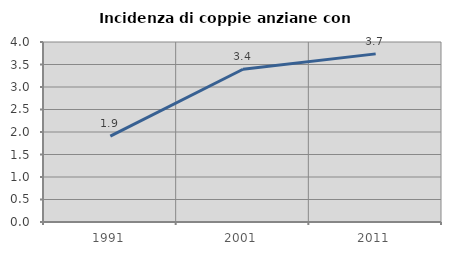
| Category | Incidenza di coppie anziane con figli |
|---|---|
| 1991.0 | 1.909 |
| 2001.0 | 3.395 |
| 2011.0 | 3.736 |